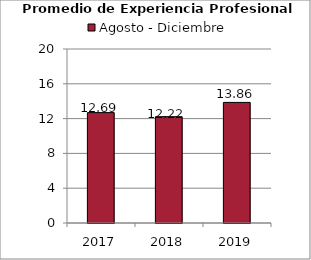
| Category | Agosto - Diciembre |
|---|---|
| 2017.0 | 12.687 |
| 2018.0 | 12.22 |
| 2019.0 | 13.86 |